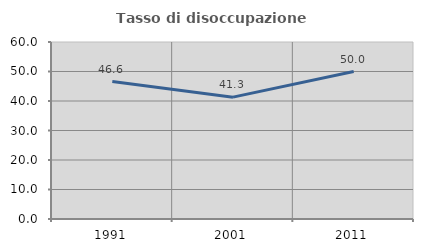
| Category | Tasso di disoccupazione giovanile  |
|---|---|
| 1991.0 | 46.591 |
| 2001.0 | 41.304 |
| 2011.0 | 50 |